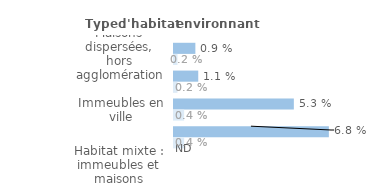
| Category | Series 1 | Series 0 |
|---|---|---|
| Maisons dispersées, hors agglomération | 0.009 | 0.002 |
| Maisons en lotissement, en quartier pavillonnaire | 0.011 | 0.002 |
| Immeubles en ville | 0.053 | 0.004 |
| Immeubles en cité ou grand ensemble | 0.068 | 0.004 |
| Habitat mixte : immeubles et maisons | 0 | 0 |